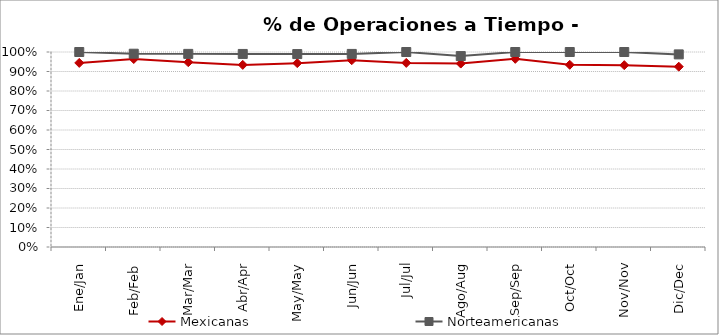
| Category | Mexicanas | Norteamericanas |
|---|---|---|
| Ene/Jan | 0.944 | 1 |
| Feb/Feb | 0.964 | 0.991 |
| Mar/Mar | 0.948 | 0.99 |
| Abr/Apr | 0.934 | 0.99 |
| May/May | 0.943 | 0.989 |
| Jun/Jun | 0.958 | 0.99 |
| Jul/Jul | 0.944 | 1 |
| Ago/Aug | 0.941 | 0.979 |
| Sep/Sep | 0.965 | 1 |
| Oct/Oct | 0.934 | 1 |
| Nov/Nov | 0.933 | 1 |
| Dic/Dec | 0.925 | 0.988 |